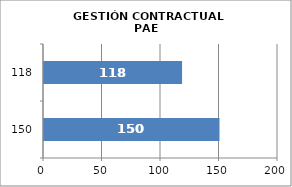
| Category | Series 0 |
|---|---|
| 150.0 | 150 |
| 118.0 | 118 |